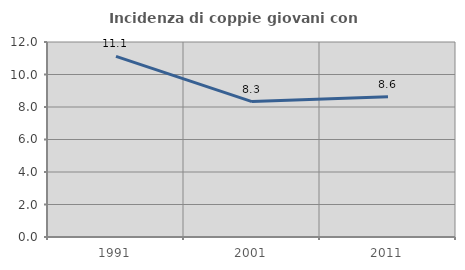
| Category | Incidenza di coppie giovani con figli |
|---|---|
| 1991.0 | 11.111 |
| 2001.0 | 8.333 |
| 2011.0 | 8.633 |